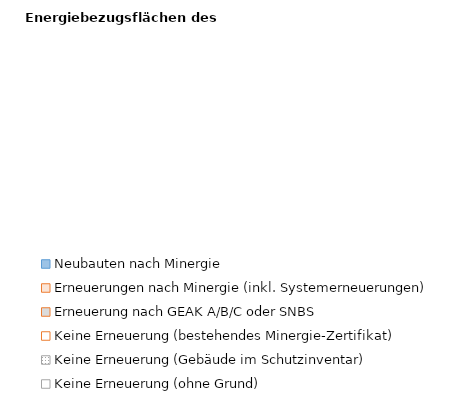
| Category | Series 0 |
|---|---|
| Neubauten nach Minergie | 0 |
| Erneuerungen nach Minergie (inkl. Systemerneuerungen) | 0 |
| Erneuerung nach GEAK A/B/C oder SNBS | 0 |
| Keine Erneuerung (bestehendes Minergie-Zertifikat) | 0 |
| Keine Erneuerung (Gebäude im Schutzinventar) | 0 |
| Keine Erneuerung (ohne Grund) | 0 |